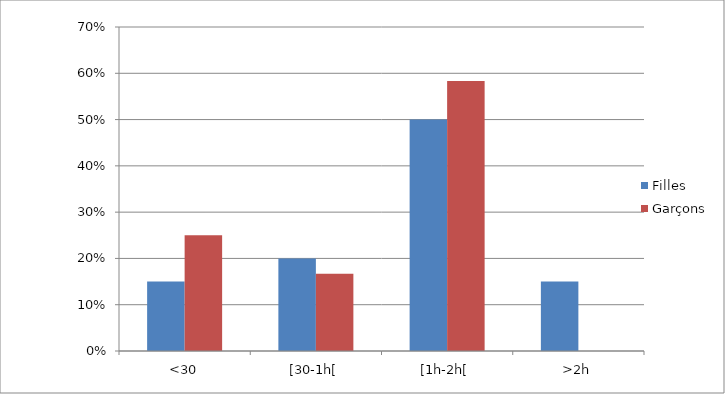
| Category | Filles | Garçons |
|---|---|---|
| <30 | 0.15 | 0.25 |
| [30-1h[ | 0.2 | 0.167 |
| [1h-2h[ | 0.5 | 0.583 |
| >2h | 0.15 | 0 |